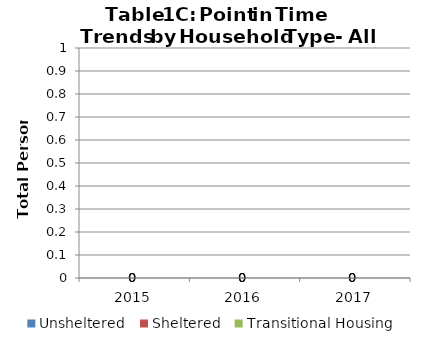
| Category | Unsheltered | Sheltered | Transitional Housing |
|---|---|---|---|
| 2015.0 | 0 | 0 | 0 |
| 2016.0 | 0 | 0 | 0 |
| 2017.0 | 0 | 0 | 0 |